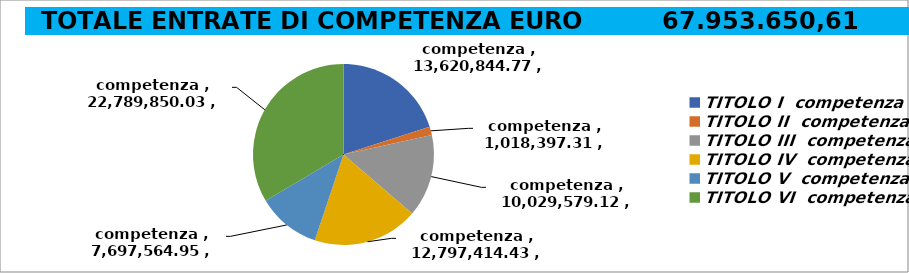
| Category | Series 0 |
|---|---|
| 0 | 13620844.77 |
| 1 | 1018397.31 |
| 2 | 10029579.12 |
| 3 | 12797414.43 |
| 4 | 7697564.95 |
| 5 | 22789850.03 |